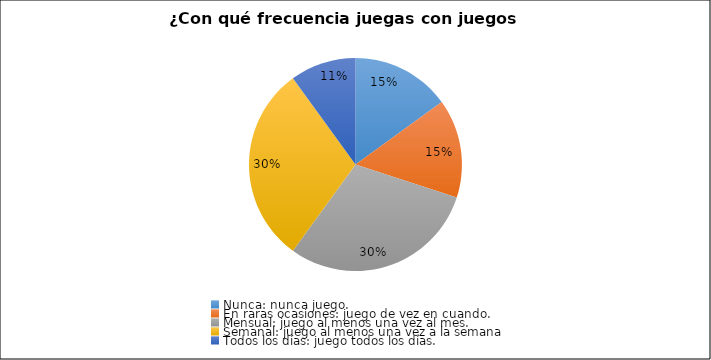
| Category | Series 0 |
|---|---|
| Nunca: nunca juego. | 3 |
| En raras ocasiones: juego de vez en cuando. | 3 |
| Mensual: juego al menos una vez al mes. | 6 |
| Semanal: juego al menos una vez a la semana | 6 |
| Todos los días: juego todos los días. | 2 |